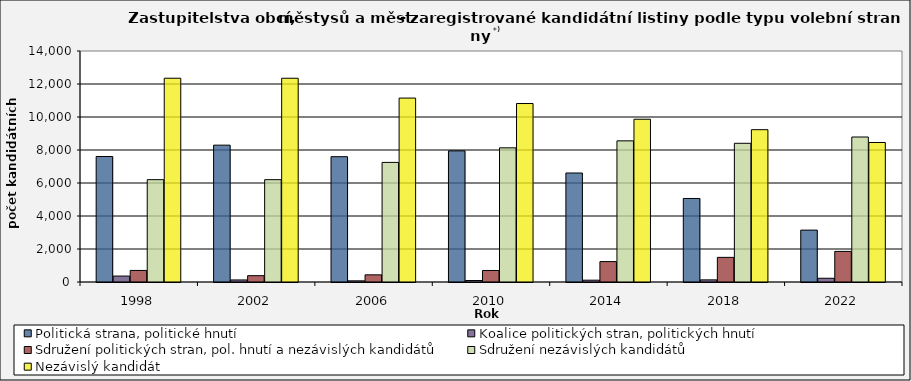
| Category | Politická strana, politické hnutí  | Koalice politických stran, politických hnutí | Sdružení politických stran, pol. hnutí a nezávislých kandidátů | Sdružení nezávislých kandidátů | Nezávislý kandidát |
|---|---|---|---|---|---|
| 1998.0 | 7606 | 360 | 700 | 6202 | 12350 |
| 2002.0 | 8294 | 125 | 384 | 6201 | 12349 |
| 2006.0 | 7595 | 71 | 434 | 7249 | 11147 |
| 2010.0 | 7948 | 90 | 697 | 8131 | 10817 |
| 2014.0 | 6606 | 110 | 1236 | 8554 | 9864 |
| 2018.0 | 5062 | 129 | 1493 | 8407 | 9232 |
| 2022.0 | 3144 | 227 | 1855 | 8787 | 8454 |